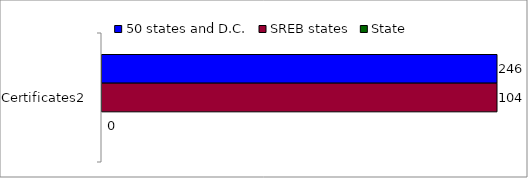
| Category | 50 states and D.C. | SREB states | State |
|---|---|---|---|
| Certificates2 | 246 | 104 | 0 |